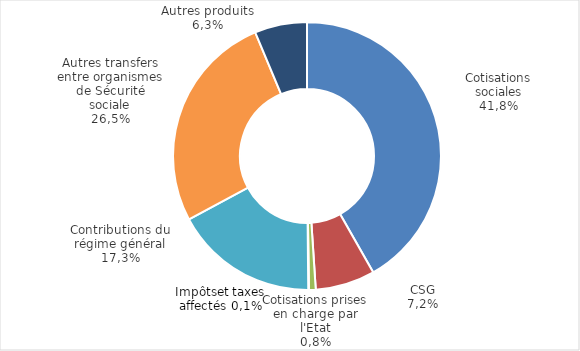
| Category | Series 0 |
|---|---|
| Cotisations sociales | 6497.344 |
| CSG | 1118.755 |
| Cotisations prises en charge par l'Etat | 126.828 |
| Impôts et taxes affectés | 12.053 |
| Contributions du Régime Général (transferts d'équilibrage) | 2691.966 |
| Autres transferts entre organismes de Sécurité sociale et assimilées* | 4127.469 |
| Autres produits** | 982.277 |